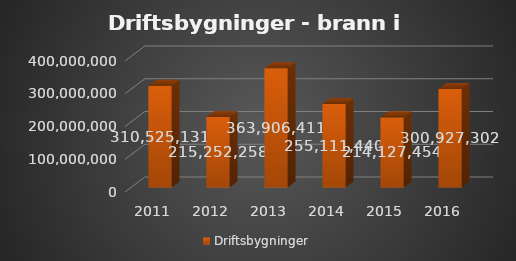
| Category | Driftsbygninger |
|---|---|
| 2011.0 | 310525131 |
| 2012.0 | 215252257.69 |
| 2013.0 | 363906411 |
| 2014.0 | 255111440.06 |
| 2015.0 | 214127453.93 |
| 2016.0 | 300927301.669 |